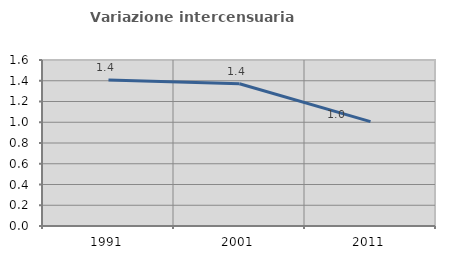
| Category | Variazione intercensuaria annua |
|---|---|
| 1991.0 | 1.406 |
| 2001.0 | 1.371 |
| 2011.0 | 1.006 |